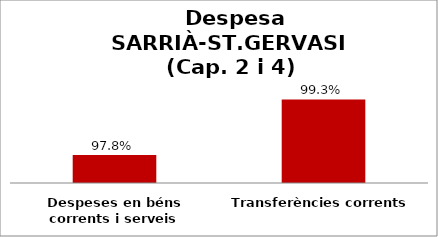
| Category | Series 0 |
|---|---|
| Despeses en béns corrents i serveis | 0.978 |
| Transferències corrents | 0.993 |